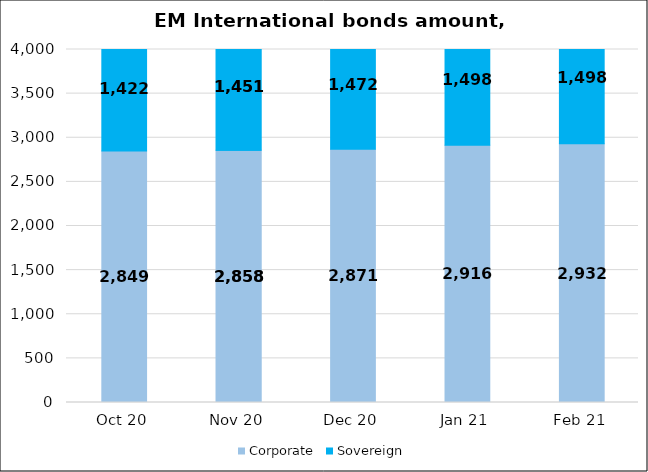
| Category | Corporate | Sovereign |
|---|---|---|
| 2020-10-31 | 2849.189 | 1422.434 |
| 2020-11-30 | 2857.623 | 1451.478 |
| 2020-11-30 | 2857.623 | 1451.478 |
| 2020-12-31 | 2870.595 | 1471.799 |
| 2021-01-31 | 2915.887 | 1497.572 |
| 2021-02-28 | 2931.658 | 1498.389 |